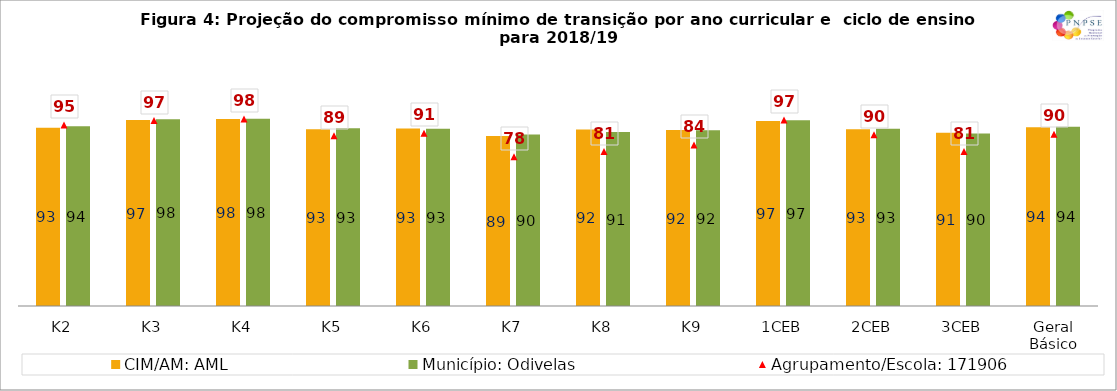
| Category | CIM/AM: | Município: |
|---|---|---|
| K2 | 93.439 | 94.208 |
| K3 | 97.409 | 97.913 |
| K4 | 98.014 | 98.18 |
| K5 | 92.587 | 93.159 |
| K6 | 92.999 | 92.847 |
| K7 | 89.079 | 89.851 |
| K8 | 92.435 | 91.159 |
| K9 | 92.206 | 92.061 |
| 1CEB | 96.918 | 97.303 |
| 2CEB | 92.604 | 92.826 |
| 3CEB | 90.843 | 90.458 |
| Geral Básico | 93.712 | 93.873 |